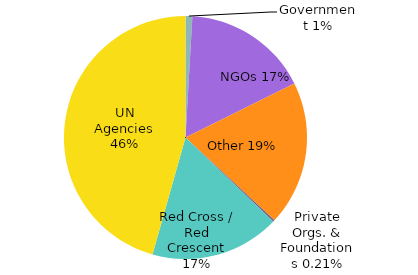
| Category | Series 0 |
|---|---|
| Government | 0.009 |
| NGOs | 0.168 |
| Other | 0.193 |
| Private Orgs. & Foundations | 0.002 |
| Red Cross / Red Crescent | 0.172 |
| UN Agencies | 0.456 |